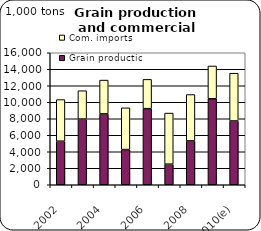
| Category | Grain production | Com. imports |
|---|---|---|
| 2002 | 5279.406 | 5045.093 |
| 2003 | 7964.172 | 3435.707 |
| 2004 | 8589.677 | 4099.473 |
| 2005 | 4265.954 | 5058.904 |
| 2006 | 9225.838 | 3547.461 |
| 2007 | 2494.271 | 6193.297 |
| 2008 | 5313.925 | 5621 |
| 2009 | 10424.25 | 3971 |
| 2010(e) | 7728.575 | 5794.079 |